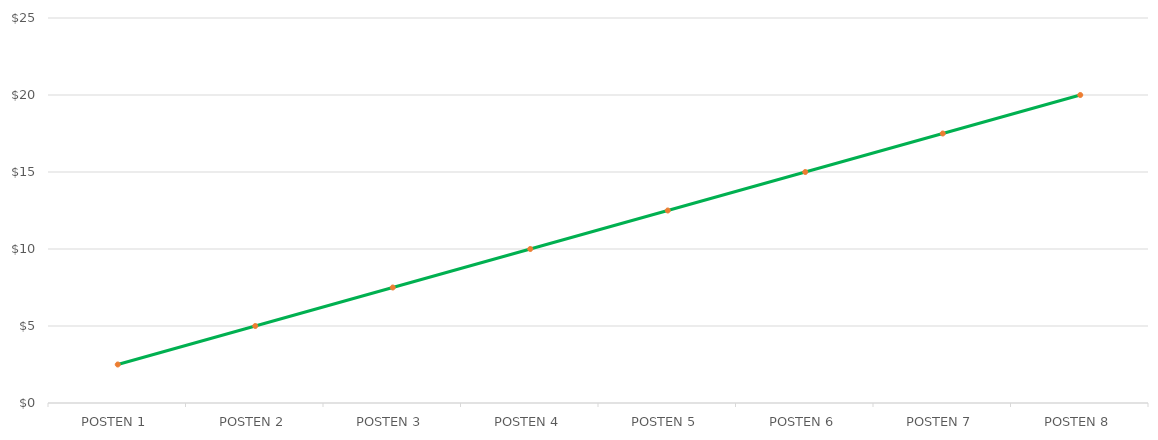
| Category | Series 1 |
|---|---|
| POSTEN 1 | 2.5 |
| POSTEN 2 | 5 |
| POSTEN 3 | 7.5 |
| POSTEN 4 | 10 |
| POSTEN 5 | 12.5 |
| POSTEN 6 | 15 |
| POSTEN 7 | 17.5 |
| POSTEN 8 | 20 |